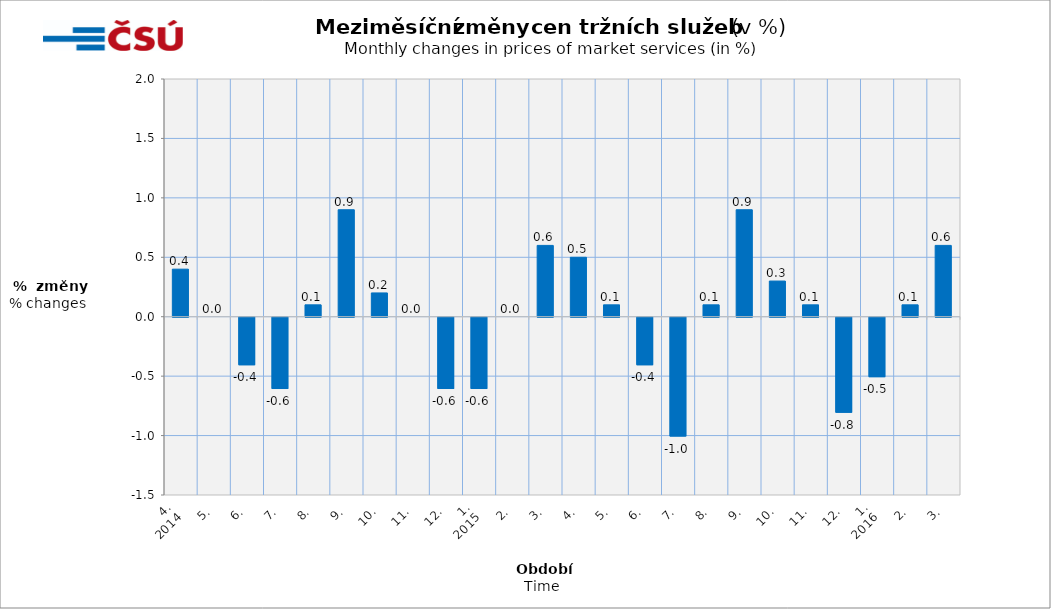
| Category | Meziměsíční změny v % |
|---|---|
| 0 | 0.4 |
| 1 | 0 |
| 2 | -0.4 |
| 3 | -0.6 |
| 4 | 0.1 |
| 5 | 0.9 |
| 6 | 0.2 |
| 7 | 0 |
| 8 | -0.6 |
| 9 | -0.6 |
| 10 | 0 |
| 11 | 0.6 |
| 12 | 0.5 |
| 13 | 0.1 |
| 14 | -0.4 |
| 15 | -1 |
| 16 | 0.1 |
| 17 | 0.9 |
| 18 | 0.3 |
| 19 | 0.1 |
| 20 | -0.8 |
| 21 | -0.5 |
| 22 | 0.1 |
| 23 | 0.6 |